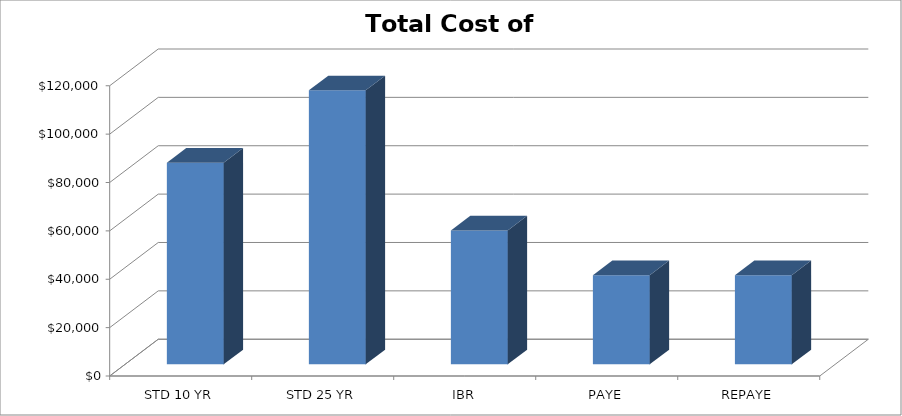
| Category | Total Monthly Loan Payments a: |
|---|---|
| STD 10 YR | 83382 |
| STD 25 YR | 113287 |
| IBR | 55332 |
| PAYE | 36888 |
| REPAYE | 36888 |